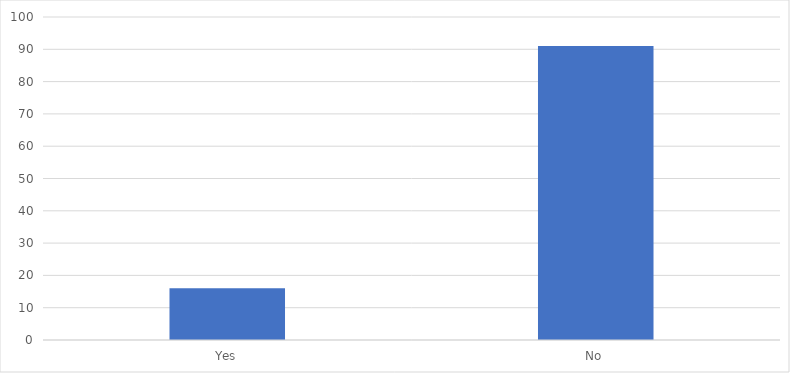
| Category | Number of Responses |
|---|---|
| Yes | 16 |
| No | 91 |